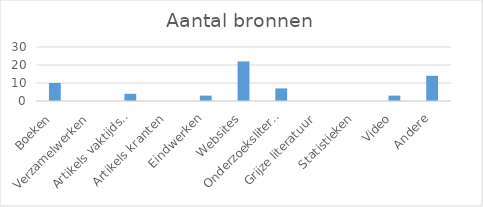
| Category | Series 0 |
|---|---|
| Boeken | 10 |
| Verzamelwerken | 0 |
| Artikels vaktijdschriften | 4 |
| Artikels kranten | 0 |
| Eindwerken | 3 |
| Websites | 22 |
| Onderzoeksliteratuur | 7 |
| Grijze literatuur | 0 |
| Statistieken | 0 |
| Video | 3 |
| Andere | 14 |